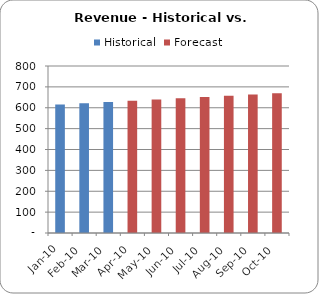
| Category | Historical | Forecast |
|---|---|---|
| Jan-10  | 615 | 0 |
| Feb-10  | 621 | 0 |
| Mar-10  | 627 | 0 |
| Apr-10  | 0 | 633 |
| May-10  | 0 | 639 |
| Jun-10  | 0 | 645 |
| Jul-10  | 0 | 651 |
| Aug-10  | 0 | 657 |
| Sep-10  | 0 | 663 |
| Oct-10  | 0 | 669 |